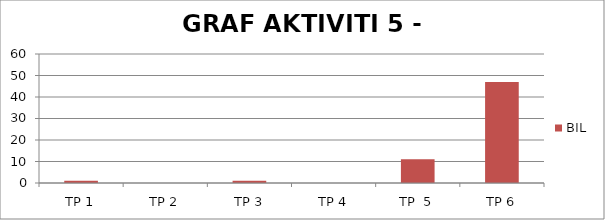
| Category | BIL |
|---|---|
| TP 1 | 1 |
| TP 2 | 0 |
|  TP 3 | 1 |
| TP 4 | 0 |
| TP  5 | 11 |
| TP 6 | 47 |